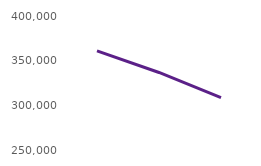
| Category | Users accessing the website |
|---|---|
| Mar24 | 360884 |
| Apr24 | 336780 |
| May24 | 308607 |